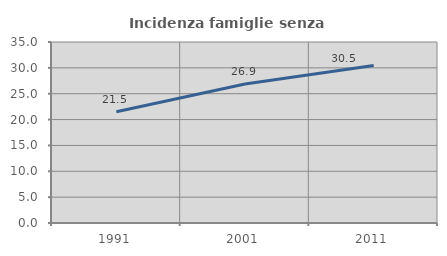
| Category | Incidenza famiglie senza nuclei |
|---|---|
| 1991.0 | 21.522 |
| 2001.0 | 26.865 |
| 2011.0 | 30.453 |